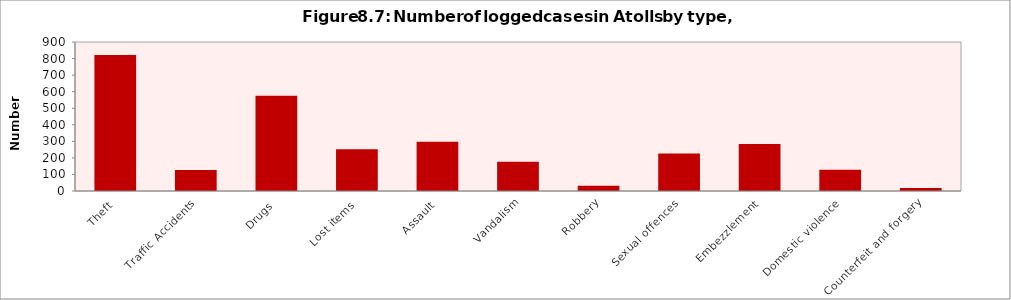
| Category | Series 0 |
|---|---|
| Theft | 821 |
| Traffic Accidents | 127 |
| Drugs | 576 |
| Lost items | 252 |
| Assault | 298 |
| Vandalism | 176 |
| Robbery | 32 |
| Sexual offences | 226 |
| Embezzlement | 284 |
| Domestic violence | 128 |
| Counterfeit and forgery | 18 |